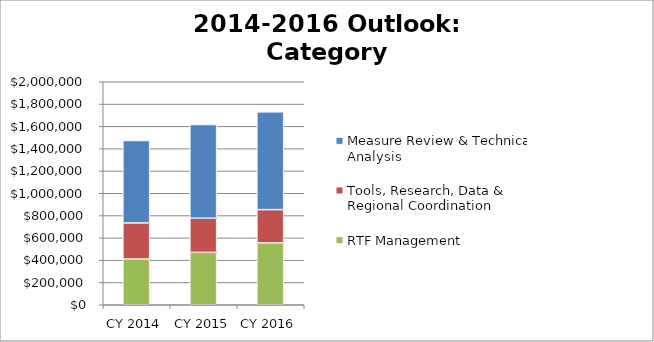
| Category | RTF Management | Tools, Research, Data & Regional Coordination | Measure Review & Technical Analysis |
|---|---|---|---|
| CY 2014 | 410000 | 323500 | 739500 |
| CY 2015 | 470004 | 306472 | 839935 |
| CY 2016 | 555105 | 297980.4 | 876777.5 |